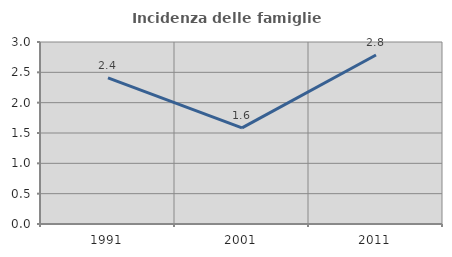
| Category | Incidenza delle famiglie numerose |
|---|---|
| 1991.0 | 2.41 |
| 2001.0 | 1.585 |
| 2011.0 | 2.785 |